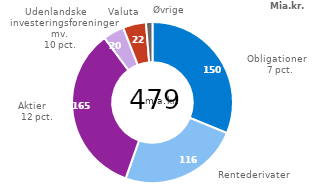
| Category | serie1 |
|---|---|
| Obligationer | 149.52 |
| Rentederivater | 116.01 |
| Aktier | 164.79 |
| Udenlandske investeringsforeninger mv. | 20.38 |
| Valuta | 22.2 |
| Øvrige | 6.25 |